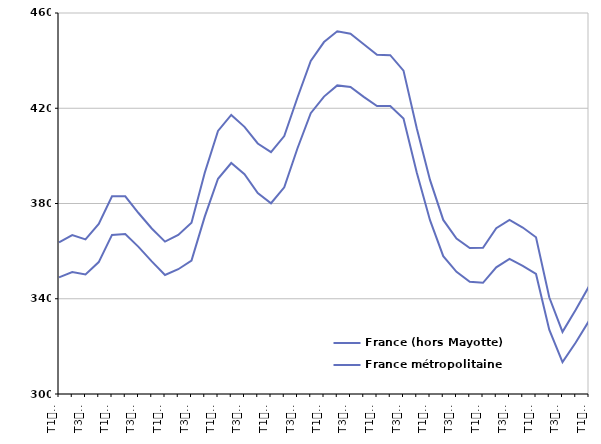
| Category | France (hors Mayotte) | France métropolitaine |
|---|---|---|
| T1
2011 | 363.7 | 349 |
| T2
2011 | 366.7 | 351.2 |
| T3
2011 | 364.9 | 350.2 |
| T4
2011 | 371.4 | 355.4 |
| T1
2012 | 383 | 366.8 |
| T2
2012 | 383 | 367.2 |
| T3
2012 | 376 | 361.8 |
| T4
2012 | 369.5 | 355.7 |
| T1
2013 | 364 | 350 |
| T2
2013 | 366.8 | 352.4 |
| T3
2013 | 371.9 | 356 |
| T4
2013 | 392.9 | 374.5 |
| T1
2014 | 410.5 | 390.4 |
| T2
2014 | 417.2 | 397 |
| T3
2014 | 412.2 | 392.3 |
| T4
2014 | 405.2 | 384.4 |
| T1
2015 | 401.6 | 380.1 |
| T2
2015 | 408.3 | 386.8 |
| T3
2015 | 424.5 | 403.2 |
| T4
2015 | 439.9 | 417.9 |
| T1
2016 | 447.8 | 424.9 |
| T2
2016 | 452.3 | 429.6 |
| T3
2016 | 451.3 | 428.9 |
| T4
2016 | 446.9 | 424.8 |
| T1
2017 | 442.5 | 420.9 |
| T2
2017 | 442.3 | 420.9 |
| T3
2017 | 435.8 | 415.7 |
| T4
2017 | 411.6 | 393 |
| T1
2018 | 389.9 | 373 |
| T2
2018 | 373.1 | 357.9 |
| T3
2018 | 365.3 | 351.3 |
| T4
2018 | 361.3 | 347.1 |
| T1
2019 | 361.4 | 346.7 |
| T2
2019 | 369.6 | 353.2 |
| T3
2019 | 373.1 | 356.7 |
| T4
2019 | 369.9 | 353.8 |
| T1
2020 | 365.8 | 350.4 |
| T2
2020 | 340.6 | 327 |
| T3
2020 | 326.1 | 313.4 |
| T4
2020 | 335.4 | 321.6 |
| T1
2021 | 345.2 | 330.7 |